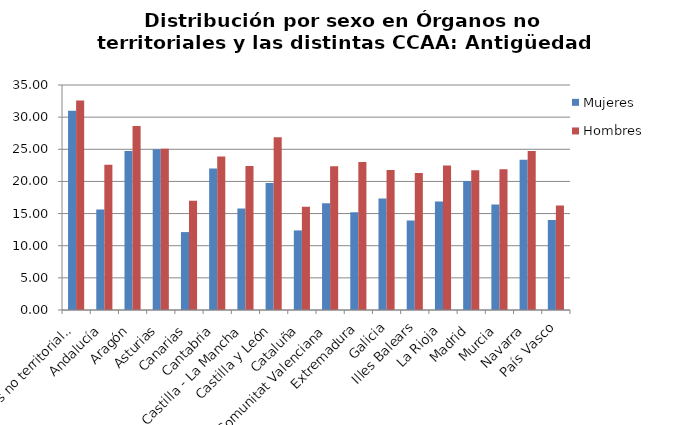
| Category | Mujeres | Hombres |
|---|---|---|
| Órganos no territoriales | 31 | 32.59 |
| Andalucía | 15.62 | 22.59 |
| Aragón | 24.74 | 28.62 |
| Asturias | 25.02 | 25.07 |
| Canarias | 12.12 | 16.98 |
| Cantabria | 22.01 | 23.88 |
| Castilla - La Mancha | 15.79 | 22.4 |
| Castilla y León | 19.76 | 26.89 |
| Cataluña | 12.38 | 16.07 |
| Comunitat Valenciana | 16.62 | 22.38 |
| Extremadura | 15.22 | 23.02 |
| Galicia | 17.35 | 21.77 |
| Illes Balears | 13.92 | 21.3 |
| La Rioja | 16.88 | 22.46 |
| Madrid | 20.07 | 21.74 |
| Murcia | 16.41 | 21.89 |
| Navarra | 23.36 | 24.75 |
| País Vasco | 13.99 | 16.27 |